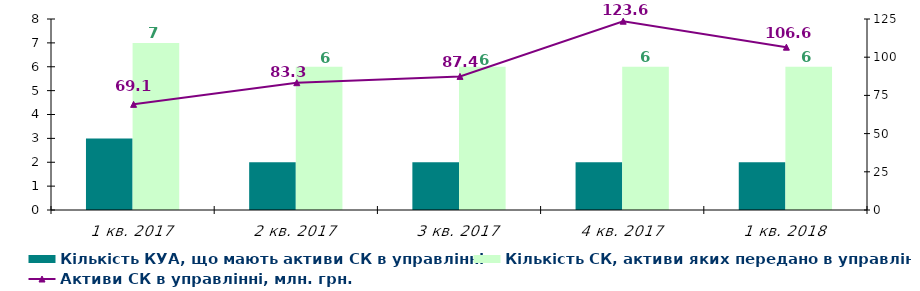
| Category | Кількість КУА, що мають активи СК в управлінні | Кількість СК, активи яких передано в управління |
|---|---|---|
| 1 кв. 2017 | 3 | 7 |
| 2 кв. 2017 | 2 | 6 |
| 3 кв. 2017 | 2 | 6 |
| 4 кв. 2017 | 2 | 6 |
| 1 кв. 2018 | 2 | 6 |